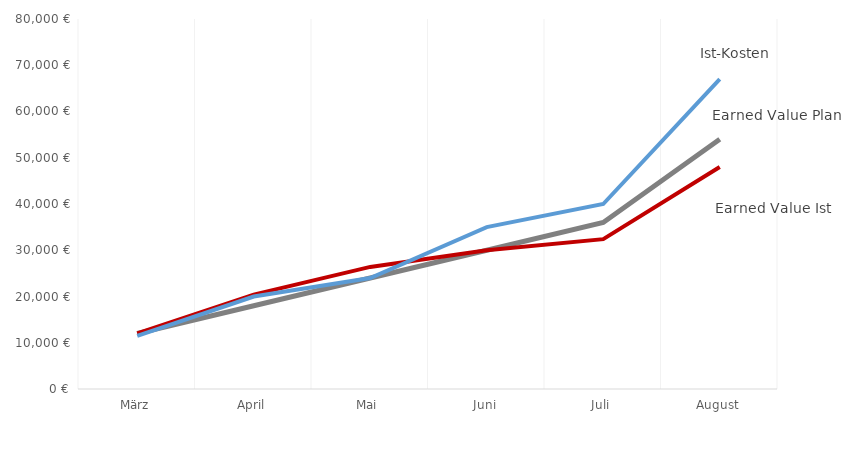
| Category | Earned Value Plan | Earned Value Ist | Ist-Kosten |
|---|---|---|---|
| März | 12000 | 12000 | 11500 |
| April | 18000 | 20400 | 20000 |
| Mai | 24000 | 26400 | 24000 |
| Juni | 30000 | 30000 | 35000 |
| Juli | 36000 | 32400 | 40000 |
| August | 54000 | 48000 | 67000 |